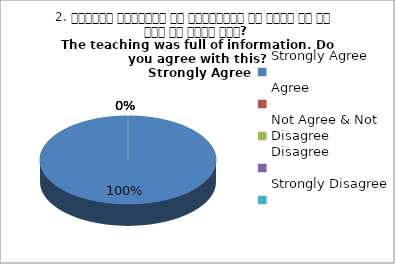
| Category | 2. शिक्षण जानकारी से परिपूर्ण था क्या आप इस बात से सहमत हैं?
The teaching was full of information. Do you agree with this?
 Strongly Agree |
|---|---|
| Strongly Agree | 1 |
| Agree | 0 |
| Not Agree & Not Disagree | 0 |
| Disagree | 0 |
| Strongly Disagree | 0 |